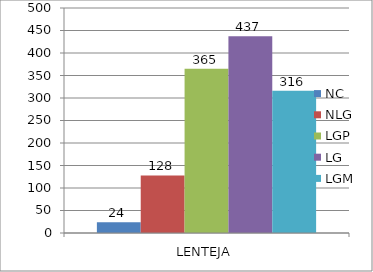
| Category | NC | NLG | LGP | LG | LGM |
|---|---|---|---|---|---|
| 0 | 24 | 128 | 365 | 437 | 316 |